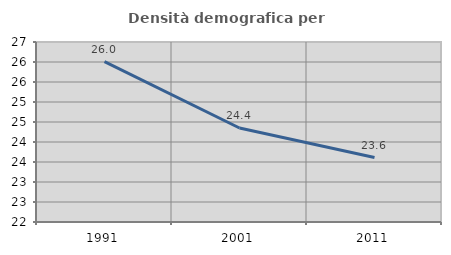
| Category | Densità demografica |
|---|---|
| 1991.0 | 26.011 |
| 2001.0 | 24.35 |
| 2011.0 | 23.612 |